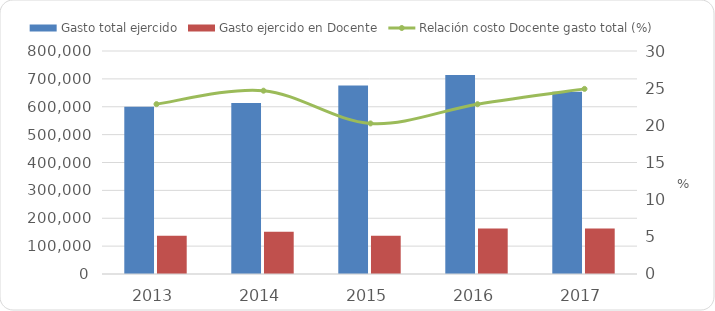
| Category | Gasto total ejercido | Gasto ejercido en Docente |
|---|---|---|
| 2013 | 600163.1 | 137147.673 |
| 2014 | 613052.1 | 151173.245 |
| 2015 | 676403.338 | 137024.068 |
| 2016 | 713725.8 | 163056.983 |
| 2017 | 653670.792 | 162783.767 |